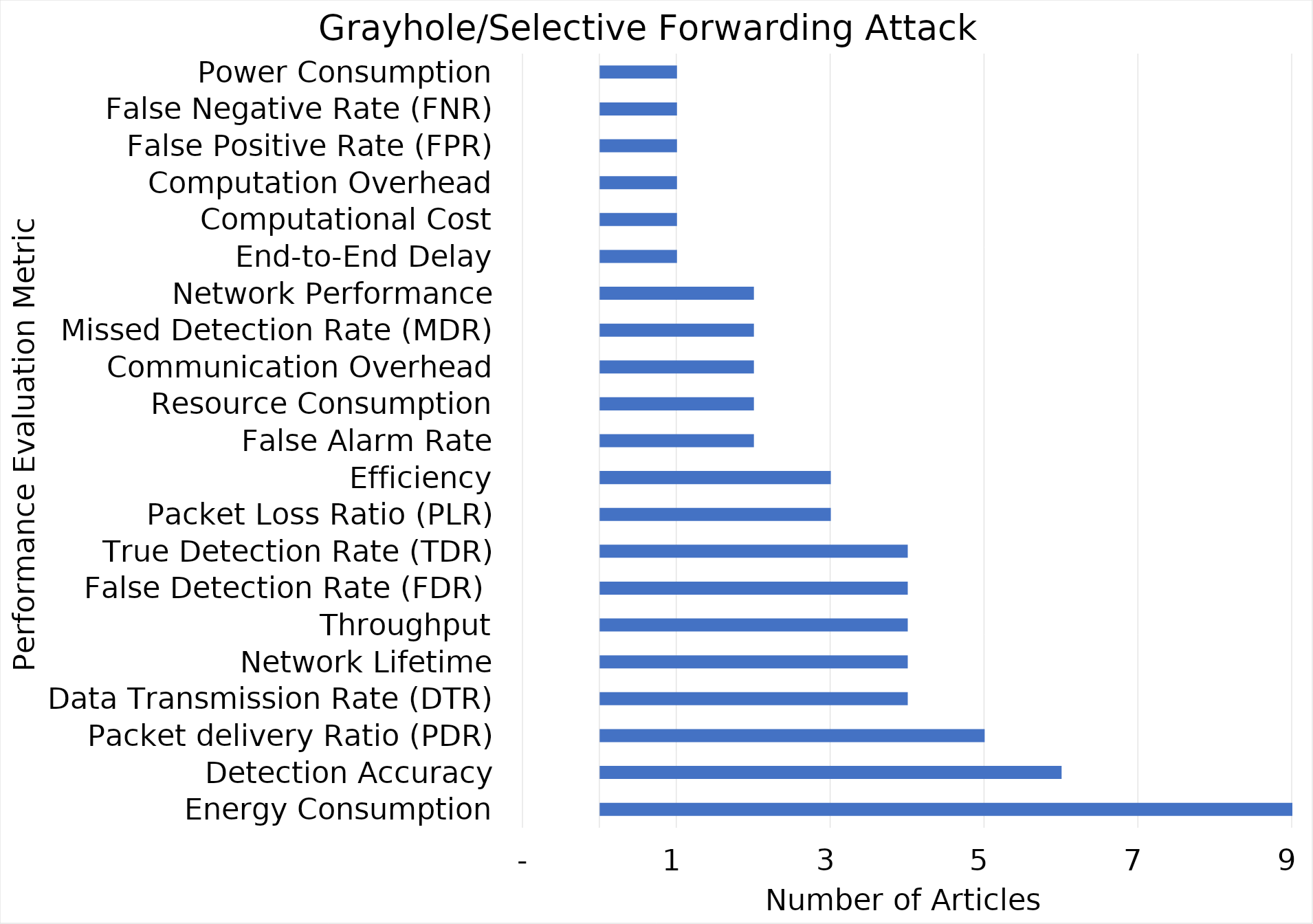
| Category | Grayhole/SF |
|---|---|
| Energy Consumption | 9 |
| Detection Accuracy | 6 |
| Packet delivery Ratio (PDR) | 5 |
| Data Transmission Rate (DTR) | 4 |
| Network Lifetime | 4 |
| Throughput | 4 |
| False Detection Rate (FDR)  | 4 |
| True Detection Rate (TDR) | 4 |
| Packet Loss Ratio (PLR) | 3 |
| Efficiency | 3 |
| False Alarm Rate | 2 |
| Resource Consumption | 2 |
| Communication Overhead | 2 |
| Missed Detection Rate (MDR) | 2 |
| Network Performance | 2 |
| End-to-End Delay | 1 |
| Computational Cost | 1 |
| Computation Overhead | 1 |
| False Positive Rate (FPR) | 1 |
| False Negative Rate (FNR) | 1 |
| Power Consumption | 1 |